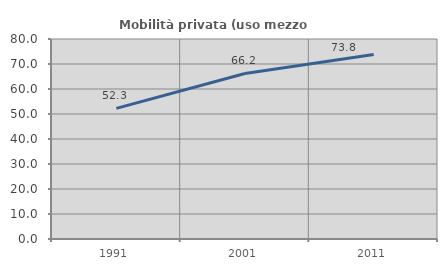
| Category | Mobilità privata (uso mezzo privato) |
|---|---|
| 1991.0 | 52.261 |
| 2001.0 | 66.208 |
| 2011.0 | 73.791 |